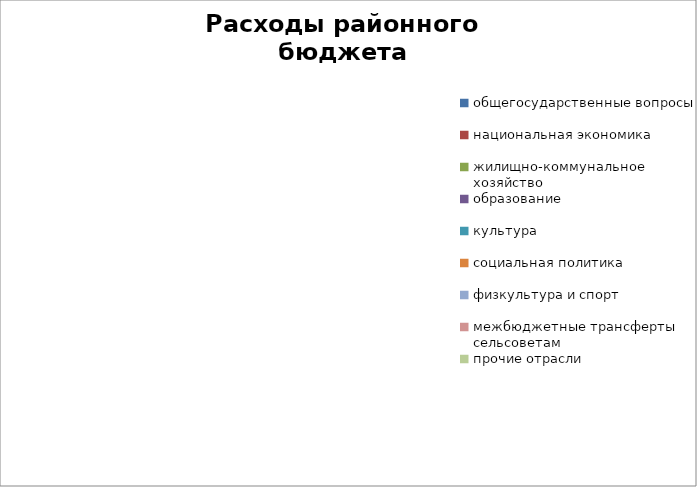
| Category | Series 0 |
|---|---|
| общегосударственные вопросы | 0 |
| национальная экономика | 0 |
| жилищно-коммунальное хозяйство | 0 |
| образование | 0 |
| культура | 0 |
| социальная политика | 0 |
| физкультура и спорт | 0 |
| межбюджетные трансферты сельсоветам | 0 |
| прочие отрасли | 0 |